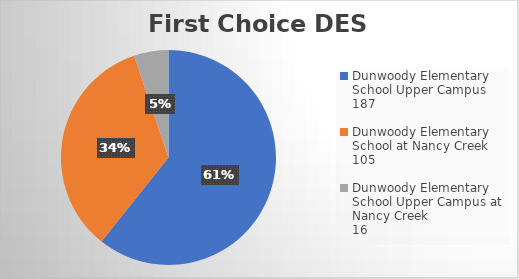
| Category | Series 0 | Series 1 | Series 2 | Series 3 | Series 4 | Series 5 |
|---|---|---|---|---|---|---|
| Dunwoody Elementary School Upper Campus
187 |  |  |  |  |  | 187 |
| Dunwoody Elementary School at Nancy Creek
105 |  |  |  |  |  | 105 |
| Dunwoody Elementary School Upper Campus at Nancy Creek
16 |  |  |  |  |  | 16 |